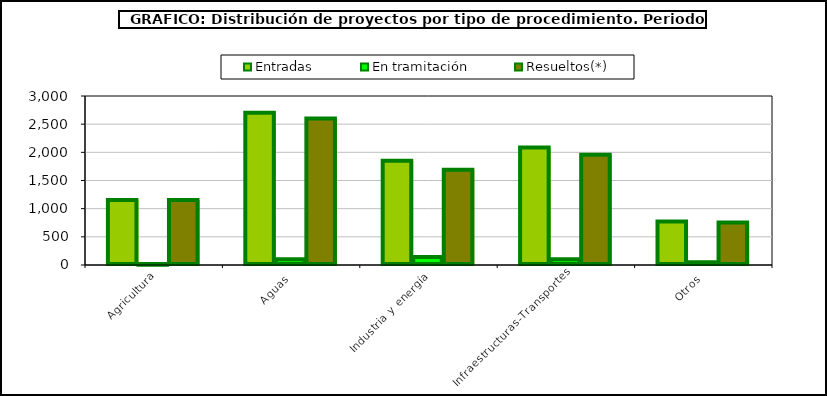
| Category | Entradas | En tramitación | Resueltos(*) |
|---|---|---|---|
| Agricultura | 1156 | 5 | 1155 |
| Aguas | 2701 | 100 | 2602 |
| Industria y energía | 1849 | 140 | 1693 |
| Infraestructuras-Transportes | 2085 | 100 | 1958 |
| Otros | 774 | 51 | 755 |